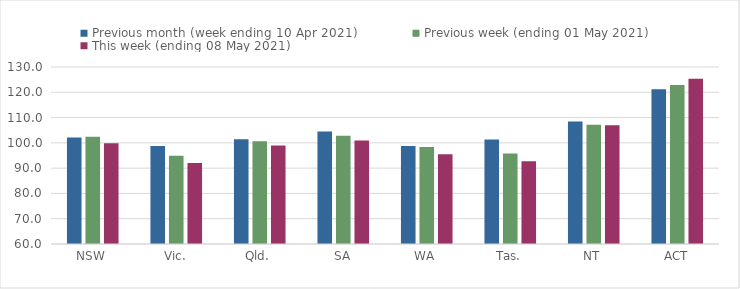
| Category | Previous month (week ending 10 Apr 2021) | Previous week (ending 01 May 2021) | This week (ending 08 May 2021) |
|---|---|---|---|
| NSW | 102.1 | 102.41 | 99.87 |
| Vic. | 98.74 | 94.93 | 92.03 |
| Qld. | 101.44 | 100.66 | 98.97 |
| SA | 104.52 | 102.85 | 100.96 |
| WA | 98.76 | 98.39 | 95.47 |
| Tas. | 101.33 | 95.8 | 92.75 |
| NT | 108.46 | 107.18 | 106.97 |
| ACT | 121.19 | 122.88 | 125.34 |